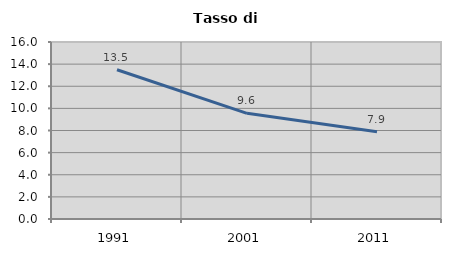
| Category | Tasso di disoccupazione   |
|---|---|
| 1991.0 | 13.492 |
| 2001.0 | 9.55 |
| 2011.0 | 7.886 |